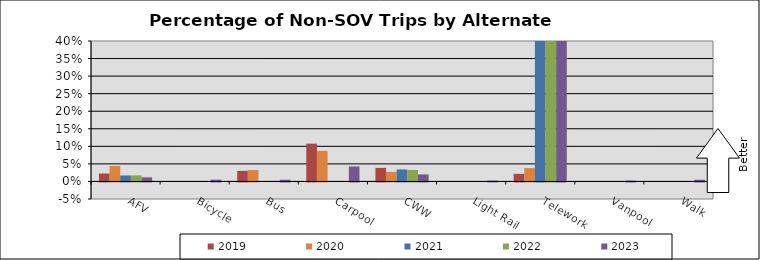
| Category | 2019 | 2020 | 2021 | 2022 | 2023 |
|---|---|---|---|---|---|
| AFV | 0.022 | 0.044 | 0.017 | 0.017 | 0.012 |
| Bicycle | 0 | 0 | 0 | 0 | 0.005 |
| Bus | 0.03 | 0.033 | 0 | 0 | 0.005 |
| Carpool | 0.108 | 0.087 | 0 | 0 | 0.043 |
| CWW | 0.039 | 0.027 | 0.034 | 0.033 | 0.02 |
| Light Rail | 0 | 0 | 0 | 0 | 0.003 |
| Telework | 0.022 | 0.038 | 0.755 | 0.696 | 0.762 |
| Vanpool | 0 | 0 | 0 | 0 | 0.003 |
| Walk | 0 | 0 | 0 | 0 | 0.005 |